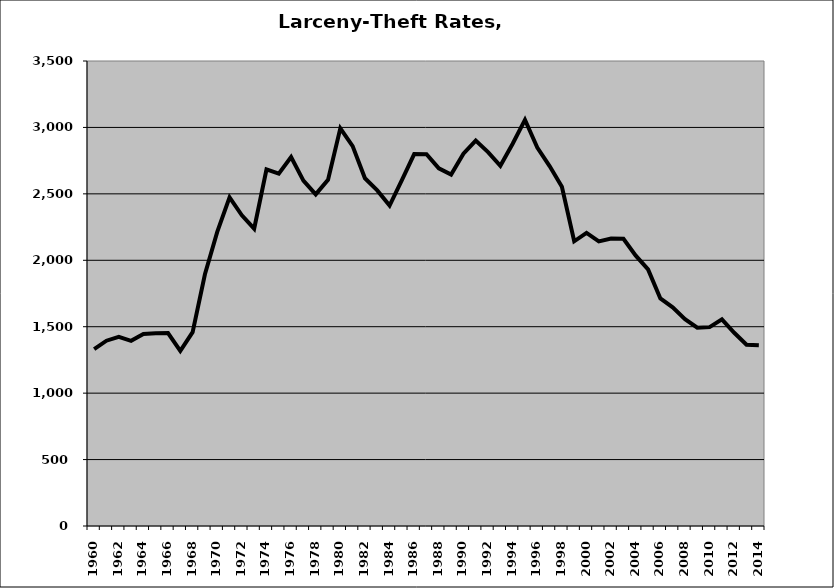
| Category | Larceny-Theft |
|---|---|
| 1960.0 | 1331.403 |
| 1961.0 | 1394.737 |
| 1962.0 | 1423.926 |
| 1963.0 | 1393.969 |
| 1964.0 | 1445.087 |
| 1965.0 | 1450.145 |
| 1966.0 | 1451.873 |
| 1967.0 | 1318.598 |
| 1968.0 | 1459.149 |
| 1969.0 | 1894.568 |
| 1970.0 | 2213.72 |
| 1971.0 | 2473.907 |
| 1972.0 | 2338.36 |
| 1973.0 | 2237.792 |
| 1974.0 | 2683.479 |
| 1975.0 | 2651.341 |
| 1976.0 | 2776.895 |
| 1977.0 | 2599.65 |
| 1978.0 | 2496.241 |
| 1979.0 | 2605.193 |
| 1980.0 | 2993.02 |
| 1981.0 | 2859.541 |
| 1982.0 | 2617.202 |
| 1983.0 | 2525.683 |
| 1984.0 | 2411.389 |
| 1985.0 | 2603.98 |
| 1986.0 | 2799.701 |
| 1987.0 | 2797.896 |
| 1988.0 | 2691.992 |
| 1989.0 | 2645.464 |
| 1990.0 | 2802.685 |
| 1991.0 | 2901.155 |
| 1992.0 | 2813.777 |
| 1993.0 | 2711.101 |
| 1994.0 | 2877.052 |
| 1995.0 | 3057.61 |
| 1996.0 | 2848.78 |
| 1997.0 | 2709.421 |
| 1998.0 | 2553.702 |
| 1999.0 | 2143.006 |
| 2000.0 | 2206.031 |
| 2001.0 | 2141.854 |
| 2002.0 | 2163.613 |
| 2003.0 | 2162.272 |
| 2004.0 | 2034.85 |
| 2005.0 | 1931.344 |
| 2006.0 | 1712.417 |
| 2007.0 | 1645.523 |
| 2008.0 | 1556.262 |
| 2009.0 | 1492.171 |
| 2010.0 | 1496.7 |
| 2011.0 | 1555.112 |
| 2012.0 | 1454.196 |
| 2013.0 | 1363.989 |
| 2014.0 | 1359.895 |